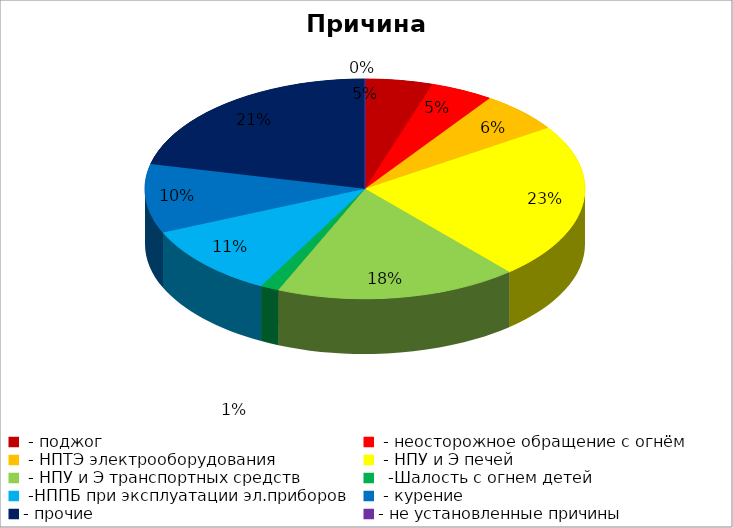
| Category | Причина пожара |
|---|---|
|  - поджог | 18 |
|  - неосторожное обращение с огнём | 17 |
|  - НПТЭ электрооборудования | 22 |
|  - НПУ и Э печей | 84 |
|  - НПУ и Э транспортных средств | 65 |
|   -Шалость с огнем детей | 5 |
|  -НППБ при эксплуатации эл.приборов | 39 |
|  - курение | 37 |
| - прочие | 78 |
| - не установленные причины | 0 |